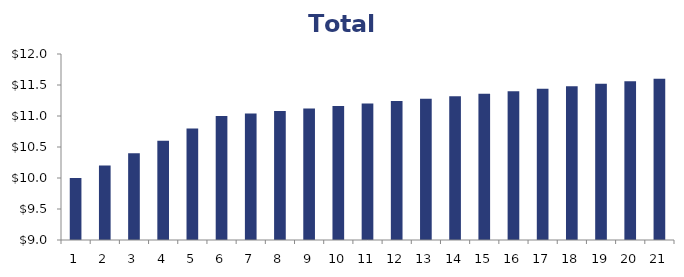
| Category | Rent |
|---|---|
| 0 | 10 |
| 1 | 10.2 |
| 2 | 10.4 |
| 3 | 10.6 |
| 4 | 10.8 |
| 5 | 11 |
| 6 | 11.04 |
| 7 | 11.08 |
| 8 | 11.12 |
| 9 | 11.16 |
| 10 | 11.2 |
| 11 | 11.24 |
| 12 | 11.28 |
| 13 | 11.32 |
| 14 | 11.36 |
| 15 | 11.4 |
| 16 | 11.44 |
| 17 | 11.48 |
| 18 | 11.52 |
| 19 | 11.56 |
| 20 | 11.6 |